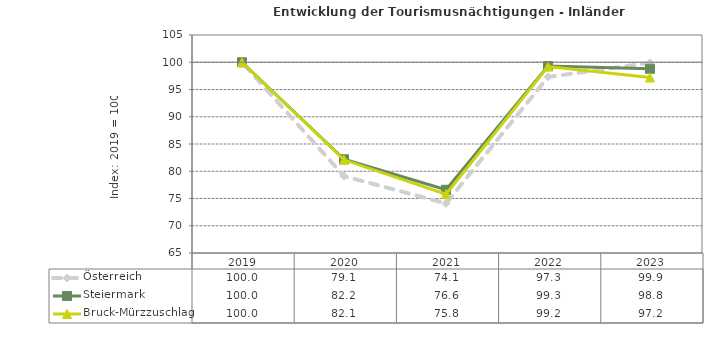
| Category | Österreich | Steiermark | Bruck-Mürzzuschlag |
|---|---|---|---|
| 2023.0 | 99.9 | 98.8 | 97.2 |
| 2022.0 | 97.3 | 99.3 | 99.2 |
| 2021.0 | 74.1 | 76.6 | 75.8 |
| 2020.0 | 79.1 | 82.2 | 82.1 |
| 2019.0 | 100 | 100 | 100 |